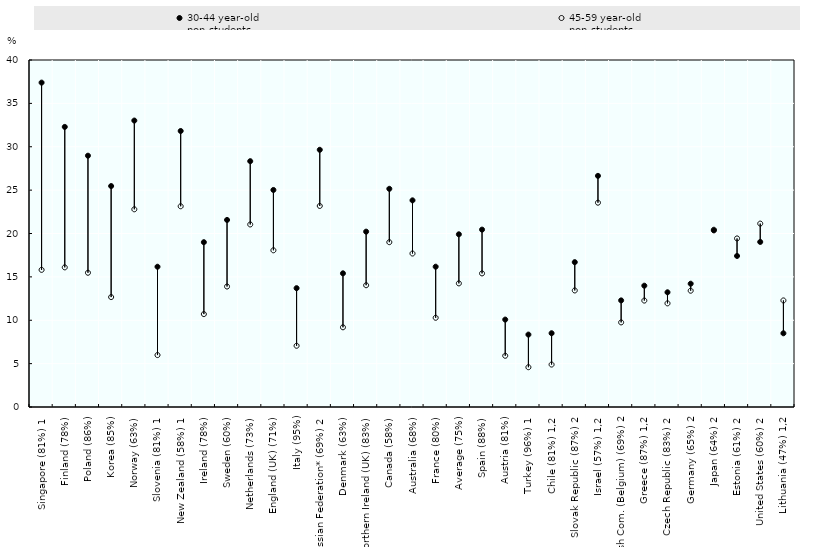
| Category | 30-44 year-old 
non-students | 45-59 year-old 
non-students |
|---|---|---|
| Singapore (81%) 1 | 37.394 | 15.808 |
| Finland (78%) | 32.288 | 16.095 |
| Poland (86%) | 28.969 | 15.474 |
| Korea (85%) | 25.469 | 12.671 |
| Norway (63%) | 33.02 | 22.79 |
| Slovenia (81%) 1 | 16.168 | 5.985 |
| New Zealand (58%) 1 | 31.818 | 23.138 |
| Ireland (78%) | 18.999 | 10.709 |
| Sweden (60%) | 21.563 | 13.887 |
| Netherlands (73%) | 28.337 | 21.041 |
| England (UK) (71%) | 25.019 | 18.064 |
| Italy (95%) | 13.7 | 7.058 |
| Russian Federation* (69%) 2 | 29.649 | 23.176 |
| Denmark (63%) | 15.41 | 9.188 |
| Northern Ireland (UK) (83%) | 20.213 | 14.037 |
| Canada (58%) | 25.152 | 18.999 |
| Australia (68%) | 23.821 | 17.693 |
| France (80%) | 16.174 | 10.284 |
| Average (75%) | 19.908 | 14.251 |
| Spain (88%) | 20.447 | 15.399 |
| Austria (81%) | 10.078 | 5.906 |
| Turkey (96%) 1 | 8.348 | 4.585 |
| Chile (81%) 1,2 | 8.505 | 4.893 |
| Slovak Republic (87%) 2 | 16.698 | 13.434 |
| Israel (57%) 1,2 | 26.643 | 23.552 |
| Flemish Com. (Belgium) (69%) 2 | 12.29 | 9.752 |
| Greece (87%) 1,2 | 13.984 | 12.269 |
| Czech Republic (83%) 2 | 13.224 | 11.947 |
| Germany (65%) 2 | 14.212 | 13.406 |
| Japan (64%) 2 | 20.359 | 20.434 |
| Estonia (61%) 2 | 17.412 | 19.433 |
| United States (60%) 2 | 19.028 | 21.141 |
| Lithuania (47%) 1,2 | 8.497 | 12.284 |